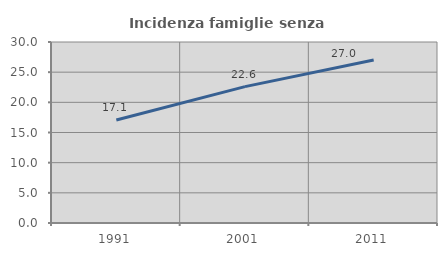
| Category | Incidenza famiglie senza nuclei |
|---|---|
| 1991.0 | 17.062 |
| 2001.0 | 22.608 |
| 2011.0 | 27.007 |